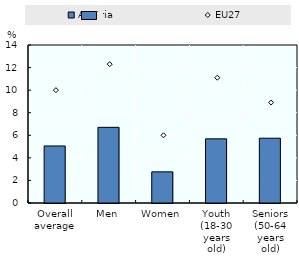
| Category | Austria |
|---|---|
| Overall average | 5.055 |
| Men | 6.705 |
| Women | 2.761 |
| Youth (18-30 years old) | 5.684 |
| Seniors (50-64 years old) | 5.741 |